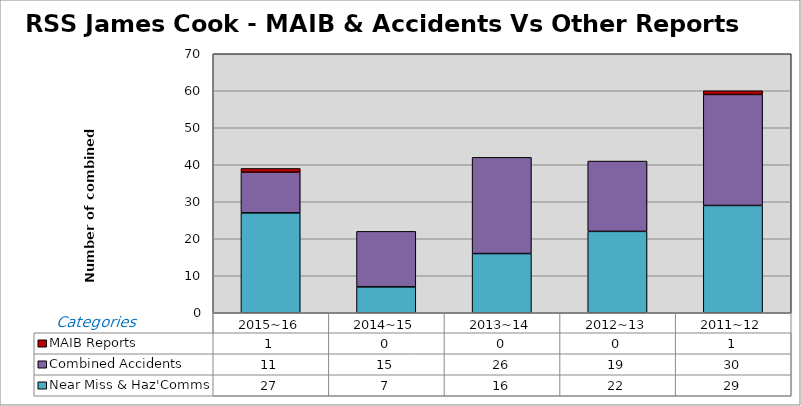
| Category | Near Miss & Haz'Comms | Combined Accidents | MAIB Reports |
|---|---|---|---|
| 2015~16 | 27 | 11 | 1 |
| 2014~15 | 7 | 15 | 0 |
| 2013~14 | 16 | 26 | 0 |
| 2012~13 | 22 | 19 | 0 |
| 2011~12 | 29 | 30 | 1 |